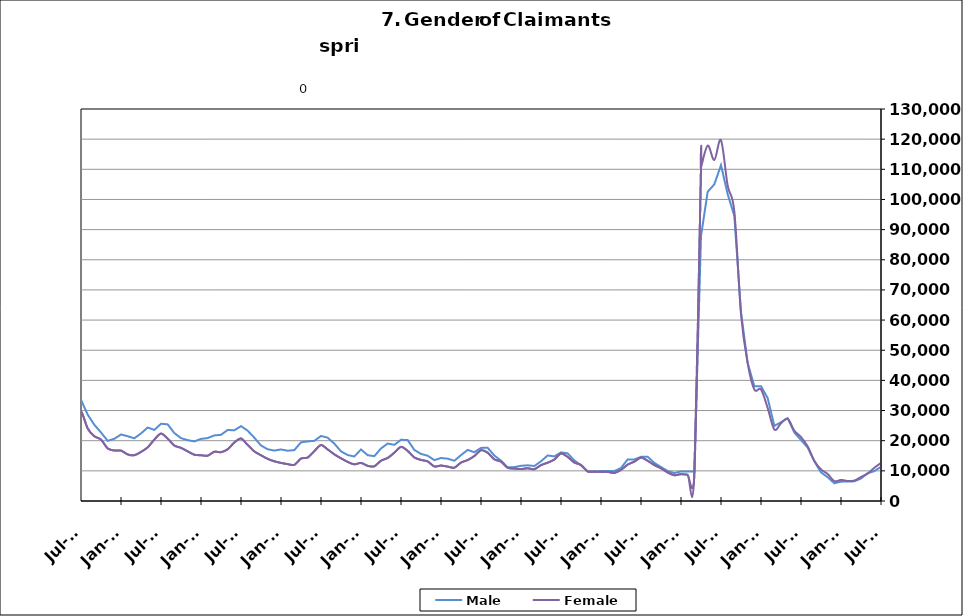
| Category | Male | Female |
|---|---|---|
| 1995-02-28 | 11910 | 7689 |
| 1995-03-31 | 12528 | 7887 |
| 1995-04-30 | 14119 | 8295 |
| 1995-05-31 | 15153 | 8659 |
| 1995-06-30 | 14654 | 9963 |
| 1995-07-31 | 16478 | 11435 |
| 1995-08-31 | 16264 | 11011 |
| 1995-09-30 | 13352 | 9104 |
| 1995-10-31 | 11499 | 8670 |
| 1995-11-30 | 10418 | 7960 |
| 1995-12-31 | 11010 | 7787 |
| 1996-01-31 | 11539 | 7863 |
| 1996-02-29 | 12768 | 7894 |
| 1996-03-31 | 13246 | 7755 |
| 1996-04-30 | 16021 | 8296 |
| 1996-05-31 | 15929 | 8751 |
| 1996-06-30 | 15291 | 10224 |
| 1996-07-31 | 17229 | 11535 |
| 1996-08-31 | 16317 | 10611 |
| 1996-09-30 | 13793 | 8812 |
| 1996-10-31 | 11431 | 8215 |
| 1996-11-30 | 10510 | 7751 |
| 1996-12-31 | 10023 | 7185 |
| 1997-01-31 | 12006 | 7404 |
| 1997-02-28 | 11976 | 7384 |
| 1997-03-31 | 11924 | 7078 |
| 1997-04-30 | 13098 | 7454 |
| 1997-05-31 | 13763 | 8032 |
| 1997-06-30 | 12872 | 9377 |
| 1997-07-31 | 15358 | 10550 |
| 1997-08-31 | 14888 | 9776 |
| 1997-09-30 | 12307 | 8016 |
| 1997-10-31 | 10749.5 | 7444 |
| 1997-11-30 | 9192 | 6872 |
| 1997-12-31 | 8541 | 6180 |
| 1998-01-31 | 9230 | 6563 |
| 1998-02-28 | 9286 | 6048 |
| 1998-03-31 | 9805 | 6012 |
| 1998-04-30 | 12254 | 7080 |
| 1998-05-31 | 13029 | 7509 |
| 1998-06-30 | 12376 | 9201 |
| 1998-07-31 | 14264 | 10448 |
| 1998-08-31 | 14319 | 9908 |
| 1998-09-30 | 12515 | 8202 |
| 1998-10-31 | 9927 | 7502 |
| 1998-11-30 | 9481 | 7563 |
| 1998-12-31 | 9422 | 7289 |
| 1999-01-31 | 10826 | 7829 |
| 1999-02-28 | 10614 | 7417 |
| 1999-03-31 | 10596 | 7180 |
| 1999-04-30 | 14139 | 8377 |
| 1999-05-31 | 14748 | 8508 |
| 1999-06-30 | 13399 | 9753 |
| 1999-07-31 | 16831 | 11294 |
| 1999-08-31 | 17466 | 10502 |
| 1999-09-30 | 14075 | 8356 |
| 1999-10-31 | 11344 | 7743 |
| 1999-11-30 | 10401 | 7623 |
| 1999-12-31 | 9702 | 6793 |
| 2000-01-31 | 10263 | 7252 |
| 2000-02-29 | 10217 | 7054 |
| 2000-03-31 | 10848 | 6860 |
| 2000-04-30 | 13099 | 8062 |
| 2000-05-31 | 13692 | 8388 |
| 2000-06-30 | 13498 | 10306 |
| 2000-07-31 | 15682 | 11874 |
| 2000-08-31 | 15407 | 10967 |
| 2000-09-30 | 12230 | 8808 |
| 2000-10-31 | 10182 | 8230 |
| 2000-11-30 | 9376 | 8049 |
| 2000-12-31 | 9229 | 7777 |
| 2001-01-31 | 10264 | 8400 |
| 2001-02-28 | 11709 | 8801 |
| 2001-03-31 | 9919 | 7036 |
| 2001-04-30 | 17255 | 11559 |
| 2001-05-31 | 18656 | 12219 |
| 2001-06-30 | 19590 | 15536 |
| 2001-07-31 | 22235 | 17388 |
| 2001-08-31 | 22550 | 16255 |
| 2001-09-30 | 20719 | 15193 |
| 2001-10-31 | 20761 | 15705 |
| 2001-11-30 | 22570 | 16084 |
| 2001-12-31 | 24429 | 16497 |
| 2002-01-31 | 26188 | 17125 |
| 2002-02-28 | 27071 | 16705 |
| 2002-03-31 | 26691 | 16475 |
| 2002-04-30 | 32125 | 20940 |
| 2002-05-31 | 31589 | 20115 |
| 2002-06-30 | 30220 | 21952 |
| 2002-07-31 | 30981 | 23132 |
| 2002-08-31 | 23858 | 16993 |
| 2002-09-30 | 27757 | 19832 |
| 2002-10-31 | 25023 | 18451 |
| 2002-11-30 | 24331 | 17763 |
| 2002-12-31 | 24361 | 17175 |
| 2003-01-31 | 24361 | 17175 |
| 2003-02-28 | 26133 | 17155 |
| 2003-03-31 | 26934 | 17491 |
| 2003-04-30 | 29393 | 19122 |
| 2003-05-31 | 30480 | 19811 |
| 2003-06-30 | 30177 | 22643 |
| 2003-07-31 | 30615 | 23565 |
| 2003-08-31 | 29860 | 22195 |
| 2003-09-30 | 26777 | 19925 |
| 2003-10-31 | 23899 | 18782 |
| 2003-11-30 | 22247 | 17944 |
| 2003-12-31 | 20902 | 16829 |
| 2004-01-31 | 20479 | 15794 |
| 2004-02-29 | 18869 | 14174 |
| 2004-03-31 | 18157 | 13452 |
| 2004-04-30 | 20525 | 14655 |
| 2004-05-31 | 20588 | 14975 |
| 2004-06-30 | 20148 | 17494 |
| 2004-07-31 | 22098 | 19064 |
| 2004-08-31 | 20778 | 16925 |
| 2004-09-30 | 17457 | 14258 |
| 2004-10-31 | 15548 | 13549 |
| 2004-11-30 | 14919 | 12836 |
| 2004-12-31 | 14200 | 11711 |
| 2005-01-31 | 14968 | 11918 |
| 2005-02-28 | 14478 | 11045 |
| 2005-03-31 | 13958 | 10426 |
| 2005-04-30 | 15898 | 11682 |
| 2005-05-31 | 16188 | 11900 |
| 2005-06-30 | 15549 | 14256 |
| 2005-07-31 | 16728 | 15274 |
| 2005-08-31 | 16418 | 13314 |
| 2005-09-30 | 12729 | 10857 |
| 2005-10-31 | 11493 | 10421 |
| 2005-11-30 | 10480 | 9638 |
| 2005-12-31 | 9482 | 8742 |
| 2006-01-31 | 9638 | 8761 |
| 2006-02-28 | 8844 | 7847 |
| 2006-03-31 | 9353 | 7709 |
| 2006-04-30 | 11916 | 9300 |
| 2006-05-31 | 12755 | 10017 |
| 2006-06-30 | 12840 | 12614 |
| 2006-07-31 | 14534 | 14007 |
| 2006-08-31 | 14510 | 12902 |
| 2006-09-30 | 12359 | 10850 |
| 2006-10-31 | 11360 | 10309 |
| 2006-11-30 | 10702 | 9403 |
| 2006-12-31 | 10886 | 9298 |
| 2007-01-31 | 11619 | 9539 |
| 2007-02-28 | 12137 | 9112 |
| 2007-03-31 | 12434 | 9125 |
| 2007-04-30 | 14864 | 10520 |
| 2007-05-31 | 16656 | 11730 |
| 2007-06-30 | 16711 | 14024 |
| 2007-07-31 | 18458 | 15882 |
| 2007-08-31 | 17879 | 14187 |
| 2007-09-30 | 16538 | 13586 |
| 2007-10-31 | 15458 | 13070 |
| 2007-11-15 | 14626 | 12172 |
| 2007-12-15 09:36:00 | 15625 | 12363 |
| 2008-01-14 19:12:00 | 17236 | 12936 |
| 2008-02-14 04:48:00 | 18262 | 12696 |
| 2008-03-15 14:24:00 | 19119 | 13263 |
| 2008-04-15 | 22039 | 15054 |
| 2008-05-15 09:36:00 | 24402 | 16733 |
| 2008-06-14 19:12:00 | 25155 | 19969 |
| 2008-07-15 04:48:00 | 27499 | 22268 |
| 2008-08-14 14:24:00 | 29286 | 21514 |
| 2008-09-14 | 30571 | 21776 |
| 2008-10-14 09:36:00 | 32282 | 22190 |
| 2008-11-13 19:12:00 | 36325 | 23395 |
| 2008-12-14 04:48:00 | 42012 | 25046 |
| 2009-01-13 14:24:00 | 49131 | 27148 |
| 2009-02-13 | 56509 | 29774 |
| 2009-03-15 09:36:00 | 63334 | 33788 |
| 2009-04-14 19:12:00 | 69062 | 36842 |
| 2009-05-15 04:48:00 | 69914 | 37773 |
| 2009-06-14 14:24:00 | 69512 | 42787 |
| 2009-07-15 | 71226 | 46347 |
| 2009-08-14 09:36:00 | 68777 | 43130 |
| 2009-09-13 19:12:00 | 65993 | 41526 |
| 2009-10-14 04:48:00 | 62480 | 40217 |
| 2009-11-13 14:24:00 | 60354 | 38454 |
| 2009-12-14 | 59507 | 36101 |
| 2010-01-13 09:36:00 | 58501 | 35014 |
| 2010-02-12 19:12:00 | 55590 | 32911 |
| 2010-03-15 04:48:00 | 53238 | 31883 |
| 2010-04-14 14:24:00 | 52264 | 32995 |
| 2010-05-15 | 50301 | 32394 |
| 2010-06-14 09:36:00 | 48130 | 36605 |
| 2010-07-14 19:12:00 | 48060 | 38748 |
| 2010-08-14 04:48:00 | 46311 | 35599 |
| 2010-09-13 14:24:00 | 41641 | 32453 |
| 2010-10-14 | 40403 | 32335 |
| 2010-11-13 09:36:00 | 38250 | 30275 |
| 2010-12-13 19:12:00 | 35858 | 26887 |
| 2011-01-13 04:48:00 | 37777 | 27522 |
| 2011-02-12 14:24:00 | 37515 | 26470 |
| 2011-03-15 | 35802 | 25248 |
| 2011-04-14 09:36:00 | 37452 | 26608 |
| 2011-05-14 19:12:00 | 37975 | 27212 |
| 2011-06-14 04:48:00 | 42289 | 36578 |
| 2011-07-14 14:24:00 | 42307 | 37061 |
| 2011-08-14 | 38125 | 31317 |
| 2011-09-13 09:36:00 | 34564 | 28090 |
| 2011-10-13 19:12:00 | 33146 | 27591 |
| 2011-11-13 04:48:00 | 31337 | 25538 |
| 2011-12-13 14:24:00 | 30334 | 23349 |
| 2012-01-13 | 31566 | 23385 |
| 2012-02-12 09:36:00 | 30859 | 22326 |
| 2012-03-13 19:12:00 | 29261 | 21568 |
| 2012-04-13 04:48:00 | 31494 | 22964 |
| 2012-05-13 14:24:00 | 32509 | 24284 |
| 2012-06-13 | 30900 | 27768 |
| 2012-07-13 09:36:00 | 33549 | 29756 |
| 2012-08-12 19:12:00 | 28663 | 24059 |
| 2012-09-12 04:48:00 | 25271 | 21482 |
| 2012-10-12 14:24:00 | 22730 | 20363 |
| 2012-11-12 | 19953 | 17450 |
| 2012-12-12 09:36:00 | 20635 | 16737 |
| 2013-01-11 19:12:00 | 22057 | 16712 |
| 2013-02-11 04:48:00 | 21486 | 15451 |
| 2013-03-13 14:24:00 | 20791 | 15186 |
| 2013-04-13 | 22409 | 16286 |
| 2013-05-13 09:36:00 | 24366 | 17794 |
| 2013-06-12 19:12:00 | 23573 | 20360 |
| 2013-07-13 04:48:00 | 25613 | 22369 |
| 2013-08-12 14:24:00 | 25420 | 20697 |
| 2013-09-12 | 22525 | 18385 |
| 2013-10-12 09:36:00 | 20848 | 17632 |
| 2013-11-11 19:12:00 | 20174 | 16466 |
| 2013-12-12 04:48:00 | 19765 | 15343 |
| 2014-01-11 14:24:00 | 20604 | 15183 |
| 2014-02-11 | 20864 | 15026 |
| 2014-03-13 09:36:00 | 21751 | 16343 |
| 2014-04-12 19:12:00 | 21948 | 16190 |
| 2014-05-13 04:48:00 | 23554 | 17163 |
| 2014-06-12 14:24:00 | 23446 | 19393 |
| 2014-07-13 | 24827 | 20751 |
| 2014-08-14 | 23315 | 18575 |
| 2014-09-13 09:36:00 | 20988 | 16453 |
| 2014-10-13 19:12:00 | 18411 | 15157 |
| 2014-11-13 04:48:00 | 17155 | 13975 |
| 2014-12-13 14:24:00 | 16727 | 13162 |
| 2015-01-13 | 17097 | 12633 |
| 2015-02-12 09:36:00 | 16674 | 12222 |
| 2015-03-14 19:12:00 | 16878 | 11988 |
| 2015-04-14 04:48:00 | 19448 | 14078 |
| 2015-05-14 14:24:00 | 19759 | 14413 |
| 2015-06-14 | 19952 | 16548 |
| 2015-07-14 09:36:00 | 21569 | 18572 |
| 2015-08-13 19:12:00 | 21001 | 17106 |
| 2015-09-13 04:48:00 | 19028 | 15475 |
| 2015-10-13 14:24:00 | 16459 | 14160 |
| 2015-11-13 | 15246 | 12968 |
| 2015-12-13 09:36:00 | 14756 | 12166 |
| 2016-01-12 19:12:00 | 17097 | 12633 |
| 2016-02-12 04:48:00 | 15198 | 11659 |
| 2016-03-13 14:24:00 | 14862 | 11506 |
| 2016-04-13 | 17432 | 13364 |
| 2016-05-13 09:36:00 | 19040 | 14264 |
| 2016-06-12 19:12:00 | 18628 | 16024 |
| 2016-07-13 04:48:00 | 20305 | 17959 |
| 2016-08-12 14:24:00 | 20204 | 16625 |
| 2016-09-12 | 16946 | 14443 |
| 2016-10-12 09:36:00 | 15612 | 13624 |
| 2016-11-11 19:12:00 | 15023 | 13122 |
| 2016-12-12 04:48:00 | 13560 | 11454 |
| 2017-01-11 14:24:00 | 14257 | 11754 |
| 2017-02-11 | 14028 | 11405 |
| 2017-03-13 09:36:00 | 13342 | 11038 |
| 2017-04-12 19:12:00 | 15225 | 12749 |
| 2017-05-13 04:48:00 | 16938 | 13582 |
| 2017-06-12 14:24:00 | 16188 | 14911 |
| 2017-07-13 | 17613 | 16845 |
| 2017-08-12 09:36:00 | 17640 | 16005 |
| 2017-09-11 19:12:00 | 15075 | 13806 |
| 2017-10-12 04:48:00 | 13384 | 13044 |
| 2017-11-11 14:24:00 | 11160 | 11015 |
| 2017-12-12 | 11238 | 10767 |
| 2018-01-11 09:36:00 | 11674 | 10594 |
| 2018-02-10 19:12:00 | 11835 | 10845 |
| 2018-03-13 04:48:00 | 11605 | 10548 |
| 2018-04-12 14:24:00 | 13162 | 11886 |
| 2018-05-13 | 15110 | 12712 |
| 2018-06-12 09:36:00 | 14782 | 13754 |
| 2018-07-12 19:12:00 | 16123 | 15773 |
| 2018-08-12 04:48:00 | 15808 | 14614 |
| 2018-09-11 14:24:00 | 13450 | 12761 |
| 2018-10-12 | 11831 | 11941 |
| 2018-11-11 09:36:00 | 9820 | 9821 |
| 2018-12-11 19:12:00 | 9649 | 9767 |
| 2019-01-11 04:48:00 | 9933 | 9654 |
| 2019-02-10 14:24:00 | 9925 | 9651 |
| 2019-03-13 | 9922 | 9318 |
| 2019-04-12 09:36:00 | 10950 | 10320 |
| 2019-05-12 19:12:00 | 13782 | 12072 |
| 2019-06-12 04:48:00 | 13767 | 13063 |
| 2019-07-12 14:24:00 | 14644 | 14409 |
| 2019-08-12 | 14678 | 13343 |
| 2019-09-11 09:36:00 | 12637 | 11915 |
| 2019-10-11 19:12:00 | 11254 | 10847 |
| 2019-11-11 04:48:00 | 9954 | 9467 |
| 2019-12-11 14:24:00 | 9289 | 8549 |
| 2020-01-11 | 9815 | 8911 |
| 2020-02-10 09:36:00 | 9754 | 8723 |
| 2020-03-11 19:12:00 | 9805 | 8802 |
| 2020-04-11 04:48:00 | 87837 | 110534 |
| 2020-05-11 14:24:00 | 102538 | 117856 |
| 2020-06-11 | 105039 | 113108 |
| 2020-07-11 09:36:00 | 111386 | 119644 |
| 2020-08-10 19:12:00 | 101758 | 104593 |
| 2020-09-10 04:48:00 | 94558 | 95979 |
| 2020-10-10 14:24:00 | 62680 | 62005 |
| 2020-11-10 | 45770 | 45707 |
| 2020-12-10 09:36:00 | 38071 | 36983 |
| 2021-01-09 19:12:00 | 38071 | 36983 |
| 2021-02-09 04:48:00 | 34126 | 30845 |
| 2021-03-11 14:24:00 | 24924 | 23717 |
| 2021-04-11 | 26116 | 25767 |
| 2021-05-11 09:36:00 | 27432 | 27279 |
| 2021-06-10 19:12:00 | 22711 | 23336 |
| 2021-07-11 04:48:00 | 20218 | 21201 |
| 2021-08-10 14:24:00 | 17708 | 18105 |
| 2021-09-10 | 13157 | 13319 |
| 2021-10-10 09:36:00 | 9494 | 10478 |
| 2021-11-09 19:12:00 | 7871 | 8942 |
| 2021-12-10 04:48:00 | 5889 | 6585 |
| 2022-01-09 14:24:00 | 6421 | 6988 |
| 2022-02-09 | 6439 | 6634 |
| 2022-03-11 09:36:00 | 6526 | 6780 |
| 2022-04-10 19:12:00 | 7456 | 7968 |
| 2022-05-11 04:48:00 | 9208 | 9103 |
| 2022-06-10 14:24:00 | 9908 | 11010 |
| 2022-07-11 | 11333 | 12637 |